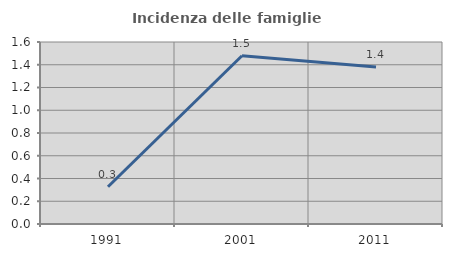
| Category | Incidenza delle famiglie numerose |
|---|---|
| 1991.0 | 0.328 |
| 2001.0 | 1.479 |
| 2011.0 | 1.381 |